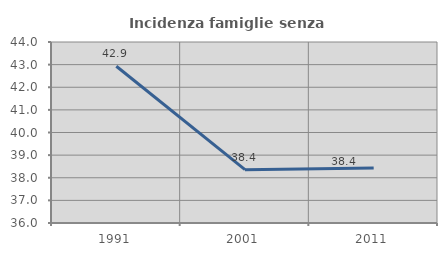
| Category | Incidenza famiglie senza nuclei |
|---|---|
| 1991.0 | 42.927 |
| 2001.0 | 38.356 |
| 2011.0 | 38.43 |